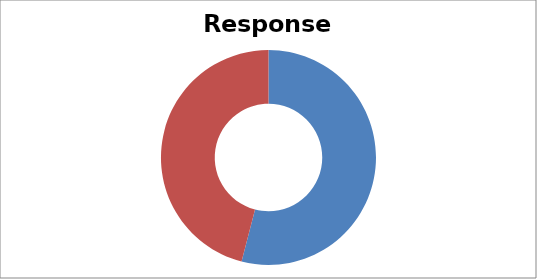
| Category | Total |
|---|---|
| Sum of Overall Response | 54.032 |
| Sum of Non-resp | 45.968 |